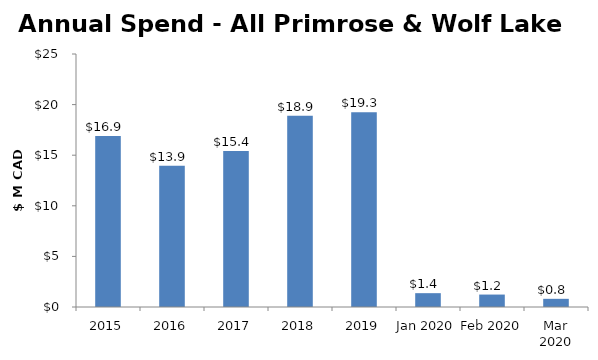
| Category | Total |
|---|---|
| 2015 | 16891071 |
| 2016 | 13945417 |
| 2017 | 15412442.75 |
| 2018 | 18910031 |
| 2019 | 19251140 |
| Jan 2020 | 1367016.97 |
| Feb 2020 | 1229367.8 |
| Mar 2020 | 807355.11 |